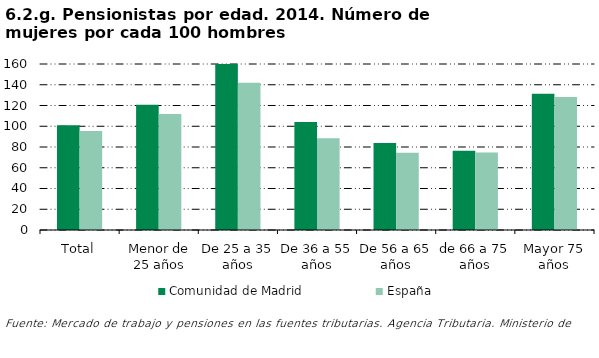
| Category | Comunidad de Madrid | España |
|---|---|---|
| Total | 101.037 | 95.506 |
| Menor de 25 años | 120.668 | 111.716 |
| De 25 a 35 años | 163.112 | 141.921 |
| De 36 a 55 años | 104.124 | 88.458 |
| De 56 a 65 años | 83.915 | 74.481 |
| de 66 a 75 años | 76.283 | 74.715 |
| Mayor 75 años | 131.363 | 128.1 |